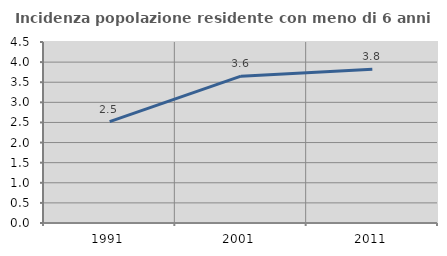
| Category | Incidenza popolazione residente con meno di 6 anni |
|---|---|
| 1991.0 | 2.521 |
| 2001.0 | 3.65 |
| 2011.0 | 3.824 |